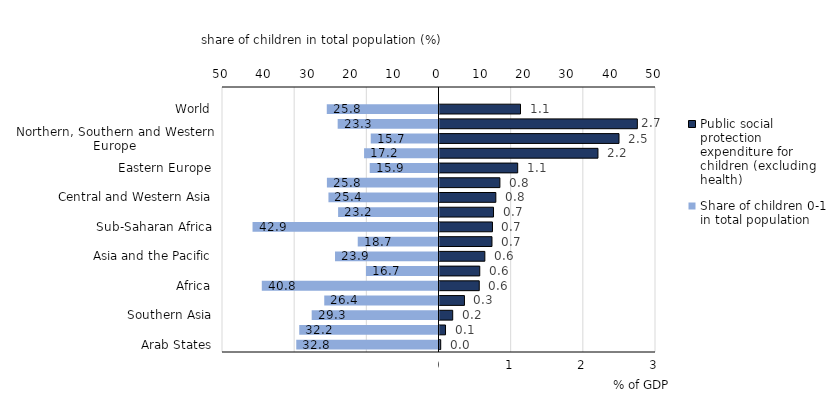
| Category | Public social protection expenditure for children (excluding health) |
|---|---|
| Arab States | 0.017 |
| Northern Africa | 0.083 |
| Southern Asia | 0.183 |
| South-Eastern Asia | 0.346 |
| Africa | 0.551 |
| Eastern Asia | 0.558 |
| Asia and the Pacific | 0.628 |
| Northern America | 0.727 |
| Sub-Saharan Africa | 0.734 |
| Americas | 0.749 |
| Central and Western Asia | 0.781 |
| Latin America and the Caribbean | 0.837 |
| Eastern Europe | 1.084 |
| Europe and Central Asia | 2.196 |
| Northern, Southern and Western Europe | 2.487 |
| Oceania | 2.742 |
| World | 1.123 |